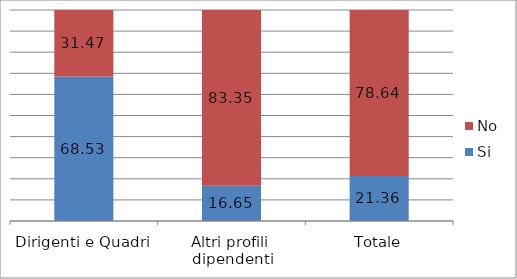
| Category | Si | No |
|---|---|---|
| Dirigenti e Quadri | 68.526 | 31.474 |
| Altri profili  dipendenti | 16.653 | 83.347 |
| Totale | 21.356 | 78.644 |